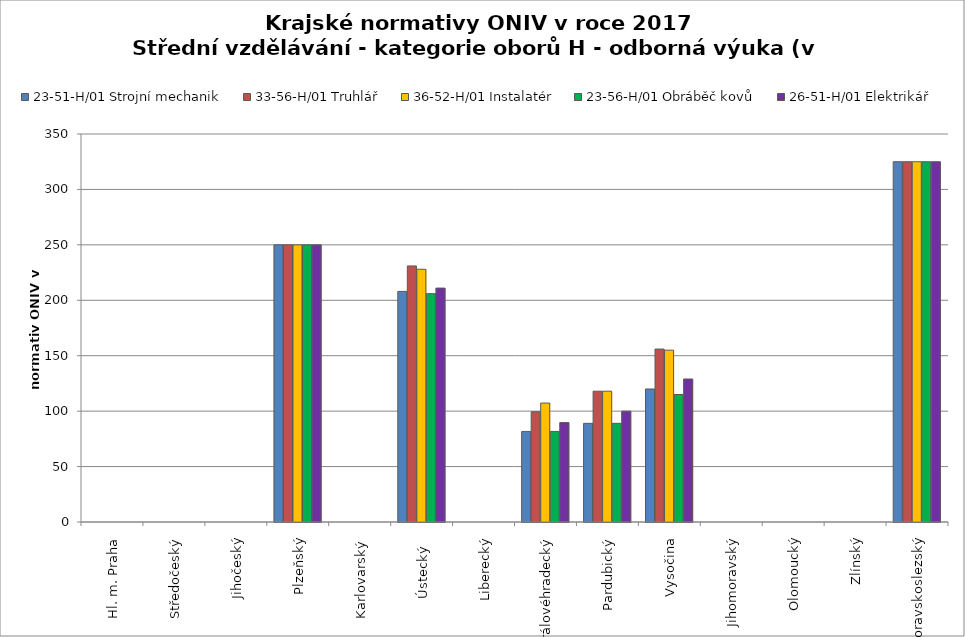
| Category | 23-51-H/01 Strojní mechanik | 33-56-H/01 Truhlář | 36-52-H/01 Instalatér | 23-56-H/01 Obráběč kovů | 26-51-H/01 Elektrikář |
|---|---|---|---|---|---|
| Hl. m. Praha | 0 | 0 | 0 | 0 | 0 |
| Středočeský | 0 | 0 | 0 | 0 | 0 |
| Jihočeský | 0 | 0 | 0 | 0 | 0 |
| Plzeňský | 250 | 250 | 250 | 250 | 250 |
| Karlovarský  | 0 | 0 | 0 | 0 | 0 |
| Ústecký   | 208 | 231 | 228 | 206 | 211 |
| Liberecký | 0 | 0 | 0 | 0 | 0 |
| Královéhradecký | 81.7 | 99.4 | 107.3 | 81.7 | 89.7 |
| Pardubický | 89 | 118 | 118 | 89 | 100 |
| Vysočina | 120 | 156 | 155 | 115 | 129 |
| Jihomoravský | 0 | 0 | 0 | 0 | 0 |
| Olomoucký | 0 | 0 | 0 | 0 | 0 |
| Zlínský | 0 | 0 | 0 | 0 | 0 |
| Moravskoslezský | 325 | 325 | 325 | 325 | 325 |